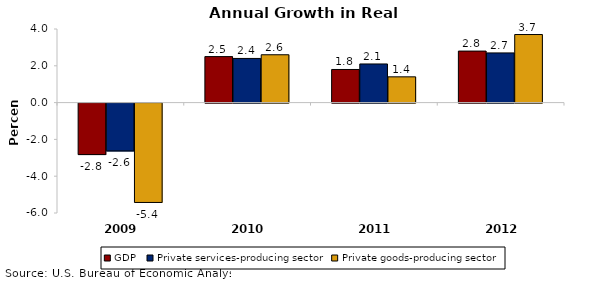
| Category | GDP | Private services-producing sector | Private goods-producing sector |
|---|---|---|---|
| 2009.0 | -2.8 | -2.6 | -5.4 |
| 2010.0 | 2.5 | 2.4 | 2.6 |
| 2011.0 | 1.8 | 2.1 | 1.4 |
| 2012.0 | 2.8 | 2.7 | 3.7 |